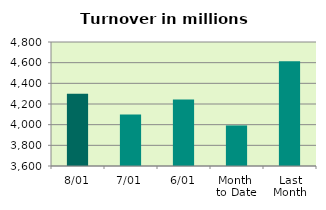
| Category | Series 0 |
|---|---|
| 8/01 | 4299.843 |
| 7/01 | 4097.98 |
| 6/01 | 4243.26 |
| Month 
to Date | 3992.575 |
| Last
Month | 4613.793 |